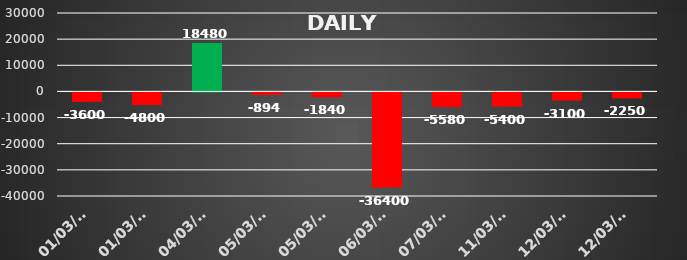
| Category | Series 0 |
|---|---|
| 2024-03-01 | -3600 |
| 2024-03-01 | -4800 |
| 2024-03-04 | 18480 |
| 2024-03-05 | -893.75 |
| 2024-03-05 | -1840 |
| 2024-03-06 | -36400 |
| 2024-03-07 | -5580 |
| 2024-03-11 | -5400 |
| 2024-03-12 | -3100 |
| 2024-03-12 | -2250 |